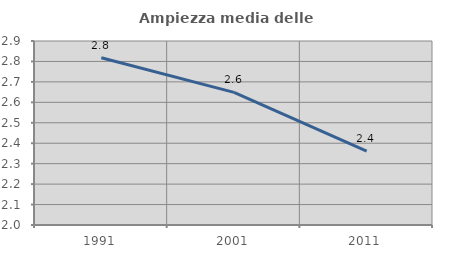
| Category | Ampiezza media delle famiglie |
|---|---|
| 1991.0 | 2.818 |
| 2001.0 | 2.649 |
| 2011.0 | 2.361 |